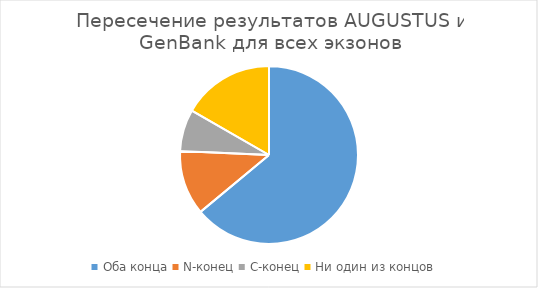
| Category | Series 0 |
|---|---|
| Оба конца | 63.97 |
| N-конец | 11.75 |
| C-конец | 7.57 |
| Ни один из концов | 16.71 |